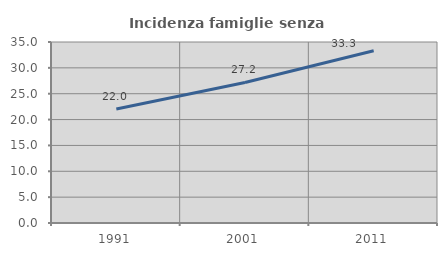
| Category | Incidenza famiglie senza nuclei |
|---|---|
| 1991.0 | 22.035 |
| 2001.0 | 27.17 |
| 2011.0 | 33.322 |